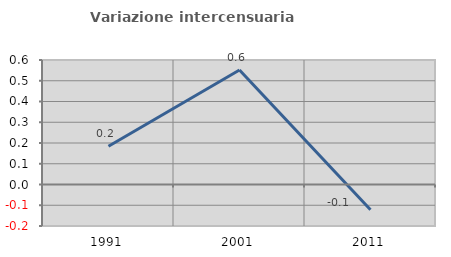
| Category | Variazione intercensuaria annua |
|---|---|
| 1991.0 | 0.184 |
| 2001.0 | 0.552 |
| 2011.0 | -0.122 |